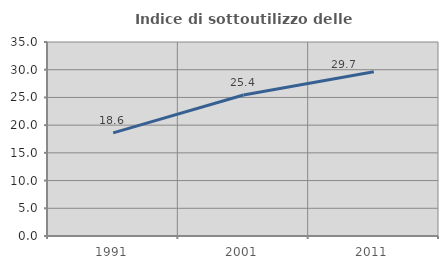
| Category | Indice di sottoutilizzo delle abitazioni  |
|---|---|
| 1991.0 | 18.613 |
| 2001.0 | 25.446 |
| 2011.0 | 29.651 |